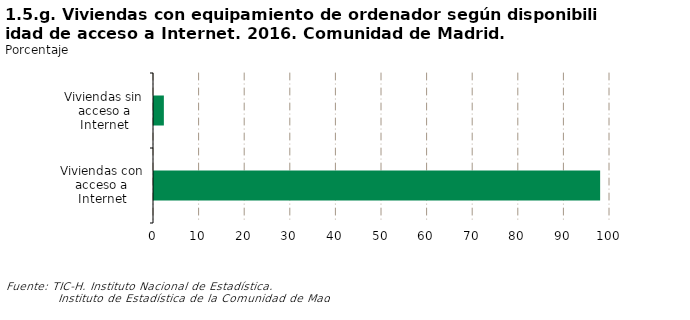
| Category | Series 0 |
|---|---|
| Viviendas con acceso a Internet | 97.837 |
| Viviendas sin acceso a Internet | 2.163 |